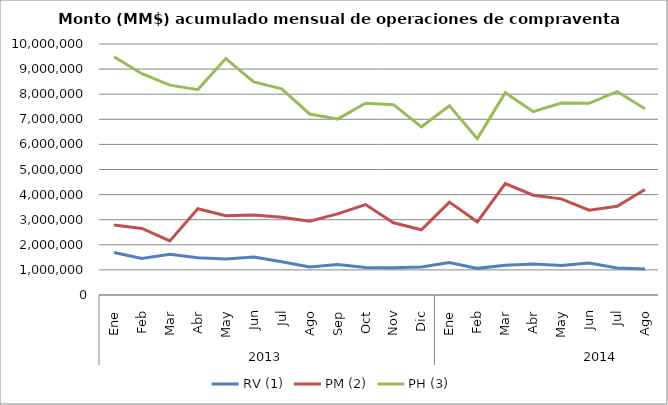
| Category | RV (1) | PM (2) | PH (3) |
|---|---|---|---|
| 0 | 1693090.019 | 2788692.01 | 9495719.157 |
| 1 | 1457870.523 | 2652319.476 | 8814454.346 |
| 2 | 1619570.46 | 2155113.626 | 8361658.957 |
| 3 | 1485677.791 | 3434435.881 | 8182321.991 |
| 4 | 1434943.507 | 3155786.06 | 9417818.094 |
| 5 | 1516566.545 | 3191285.457 | 8490151.421 |
| 6 | 1322115.523 | 3099755.507 | 8212010.547 |
| 7 | 1118245.895 | 2937089.197 | 7211658.784 |
| 8 | 1215047.725 | 3232334.418 | 7008526.172 |
| 9 | 1092035.083 | 3603082.09 | 7640993.748 |
| 10 | 1088055.605 | 2879188.198 | 7583918.365 |
| 11 | 1114851.326 | 2596986.123 | 6700659.979 |
| 12 | 1296256.43 | 3700290.091 | 7538361.261 |
| 13 | 1061199.219 | 2915830.381 | 6230064.605 |
| 14 | 1189463.212 | 4440910.02 | 8058380.739 |
| 15 | 1231035.305 | 3977428.452 | 7305106.144 |
| 16 | 1178985.046 | 3830415.456 | 7649023.753 |
| 17 | 1271543.287 | 3377453.657 | 7635505.378 |
| 18 | 1074038.901 | 3538491.307 | 8103978.154 |
| 19 | 1039238.343 | 4203748.491 | 7419437.742 |